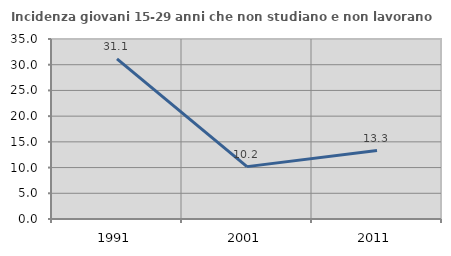
| Category | Incidenza giovani 15-29 anni che non studiano e non lavorano  |
|---|---|
| 1991.0 | 31.141 |
| 2001.0 | 10.183 |
| 2011.0 | 13.309 |